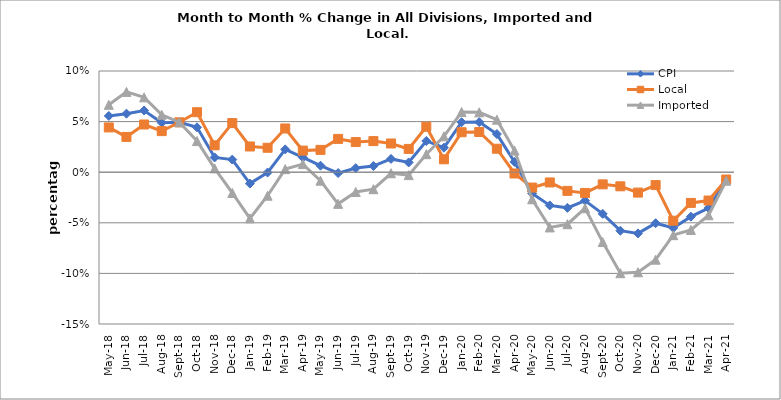
| Category | CPI | Local | Imported |
|---|---|---|---|
| 2018-05-01 | 0.056 | 0.044 | 0.067 |
| 2018-06-01 | 0.058 | 0.035 | 0.079 |
| 2018-07-01 | 0.061 | 0.047 | 0.074 |
| 2018-08-01 | 0.049 | 0.041 | 0.057 |
| 2018-09-01 | 0.049 | 0.049 | 0.049 |
| 2018-10-01 | 0.044 | 0.059 | 0.031 |
| 2018-11-01 | 0.015 | 0.027 | 0.004 |
| 2018-12-01 | 0.012 | 0.049 | -0.021 |
| 2019-01-01 | -0.011 | 0.025 | -0.046 |
| 2019-02-01 | 0 | 0.024 | -0.023 |
| 2019-03-01 | 0.023 | 0.043 | 0.003 |
| 2019-04-01 | 0.015 | 0.021 | 0.008 |
| 2019-05-01 | 0.006 | 0.022 | -0.008 |
| 2019-06-01 | -0.001 | 0.033 | -0.031 |
| 2019-07-01 | 0.004 | 0.03 | -0.02 |
| 2019-08-01 | 0.006 | 0.031 | -0.017 |
| 2019-09-01 | 0.013 | 0.028 | -0.001 |
| 2019-10-01 | 0.01 | 0.023 | -0.003 |
| 2019-11-01 | 0.031 | 0.045 | 0.018 |
| 2019-12-01 | 0.024 | 0.013 | 0.035 |
| 2020-01-01 | 0.049 | 0.039 | 0.059 |
| 2020-02-01 | 0.05 | 0.04 | 0.059 |
| 2020-03-01 | 0.038 | 0.023 | 0.052 |
| 2020-04-01 | 0.01 | -0.001 | 0.021 |
| 2020-05-01 | -0.021 | -0.015 | -0.027 |
| 2020-06-01 | -0.033 | -0.01 | -0.055 |
| 2020-07-01 | -0.035 | -0.018 | -0.051 |
| 2020-08-01 | -0.028 | -0.02 | -0.036 |
| 2020-09-01 | -0.041 | -0.012 | -0.069 |
| 2020-10-01 | -0.058 | -0.014 | -0.1 |
| 2020-11-01 | -0.06 | -0.02 | -0.099 |
| 2020-12-01 | -0.05 | -0.013 | -0.086 |
| 2021-01-01 | -0.055 | -0.048 | -0.062 |
| 2021-02-01 | -0.044 | -0.03 | -0.057 |
| 2021-03-01 | -0.035 | -0.028 | -0.043 |
| 2021-04-01 | -0.008 | -0.007 | -0.008 |